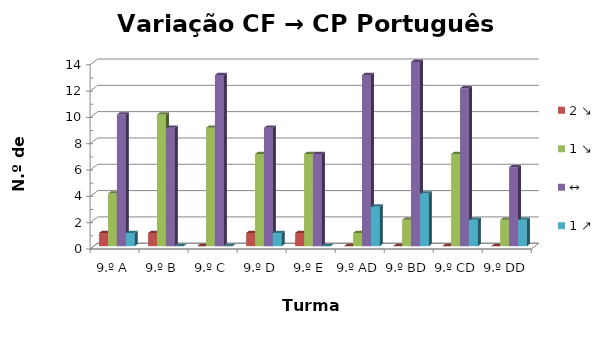
| Category | 2 ↘ | 1 ↘ | ↔ | 1 ↗ |
|---|---|---|---|---|
| 9.º A | 1 | 4 | 10 | 1 |
| 9.º B | 1 | 10 | 9 | 0 |
| 9.º C | 0 | 9 | 13 | 0 |
| 9.º D | 1 | 7 | 9 | 1 |
| 9.º E | 1 | 7 | 7 | 0 |
| 9.º AD | 0 | 1 | 13 | 3 |
| 9.º BD | 0 | 2 | 14 | 4 |
| 9.º CD | 0 | 7 | 12 | 2 |
| 9.º DD | 0 | 2 | 6 | 2 |